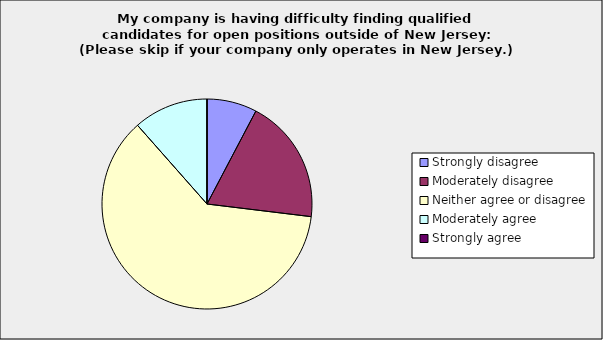
| Category | Series 0 |
|---|---|
| Strongly disagree | 0.077 |
| Moderately disagree | 0.192 |
| Neither agree or disagree | 0.615 |
| Moderately agree | 0.115 |
| Strongly agree | 0 |